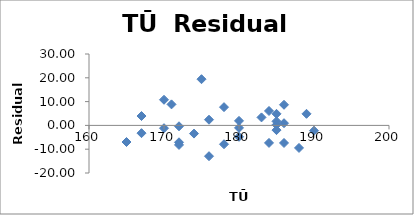
| Category | Series 0 |
|---|---|
| 167.0 | -3.264 |
| 167.0 | 3.939 |
| 180.0 | 1.906 |
| 184.0 | -7.356 |
| 180.0 | -1.04 |
| 190.0 | -2.229 |
| 185.0 | 1.71 |
| 172.0 | -7.096 |
| 184.0 | 6.063 |
| 185.0 | 4.859 |
| 186.0 | 8.668 |
| 183.0 | 3.362 |
| 185.0 | -1.979 |
| 176.0 | 2.385 |
| 178.0 | -7.915 |
| 175.0 | 19.414 |
| 189.0 | 4.867 |
| 172.0 | -0.365 |
| 186.0 | -7.386 |
| 172.0 | -8.204 |
| 165.0 | -6.978 |
| 178.0 | 7.666 |
| 176.0 | -12.939 |
| 180.0 | -4.782 |
| 170.0 | 10.772 |
| 171.0 | 8.838 |
| 185.0 | 0.237 |
| 170.0 | -1.174 |
| 174.0 | -3.436 |
| 186.0 | 0.925 |
| 188.0 | -9.469 |